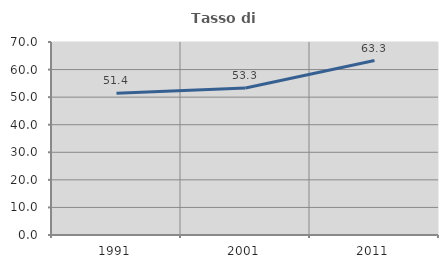
| Category | Tasso di occupazione   |
|---|---|
| 1991.0 | 51.429 |
| 2001.0 | 53.333 |
| 2011.0 | 63.265 |